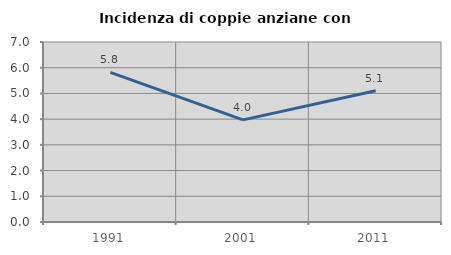
| Category | Incidenza di coppie anziane con figli |
|---|---|
| 1991.0 | 5.821 |
| 2001.0 | 3.972 |
| 2011.0 | 5.102 |